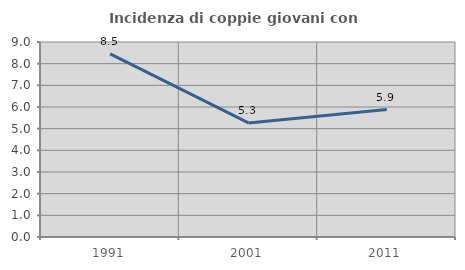
| Category | Incidenza di coppie giovani con figli |
|---|---|
| 1991.0 | 8.451 |
| 2001.0 | 5.263 |
| 2011.0 | 5.882 |